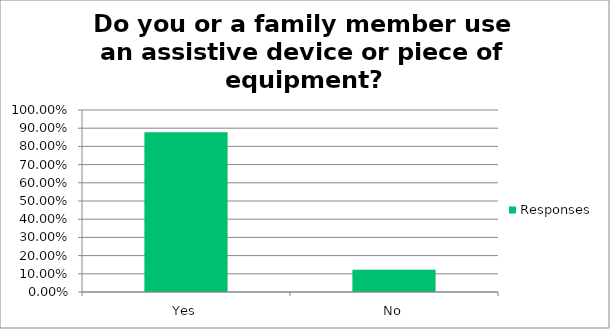
| Category | Responses |
|---|---|
| Yes | 0.878 |
| No | 0.122 |